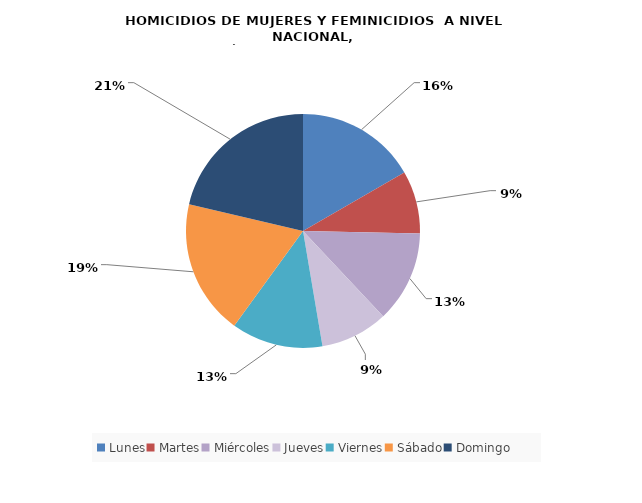
| Category | Lunes |
|---|---|
| Lunes | 25 |
| Martes | 13 |
| Miércoles | 19 |
| Jueves | 14 |
| Viernes | 19 |
| Sábado | 28 |
| Domingo | 32 |